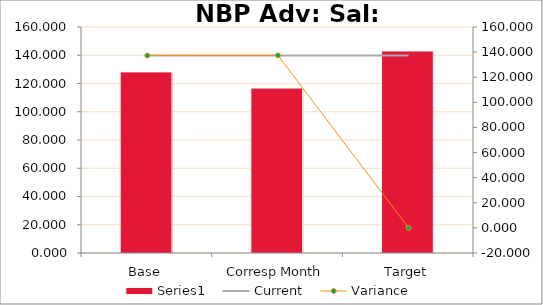
| Category | Series 0 |
|---|---|
| Base | 128.208 |
| Corresp Month | 116.773 |
| Target | 143.019 |